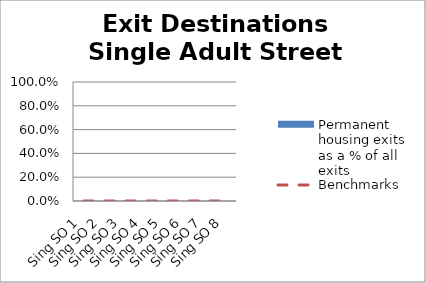
| Category | Permanent housing exits as a % of all exits |
|---|---|
| Sing SO 1 | 0 |
| Sing SO 2 | 0 |
| Sing SO 3 | 0 |
| Sing SO 4 | 0 |
| Sing SO 5 | 0 |
| Sing SO 6 | 0 |
| Sing SO 7 | 0 |
| Sing SO 8 | 0 |